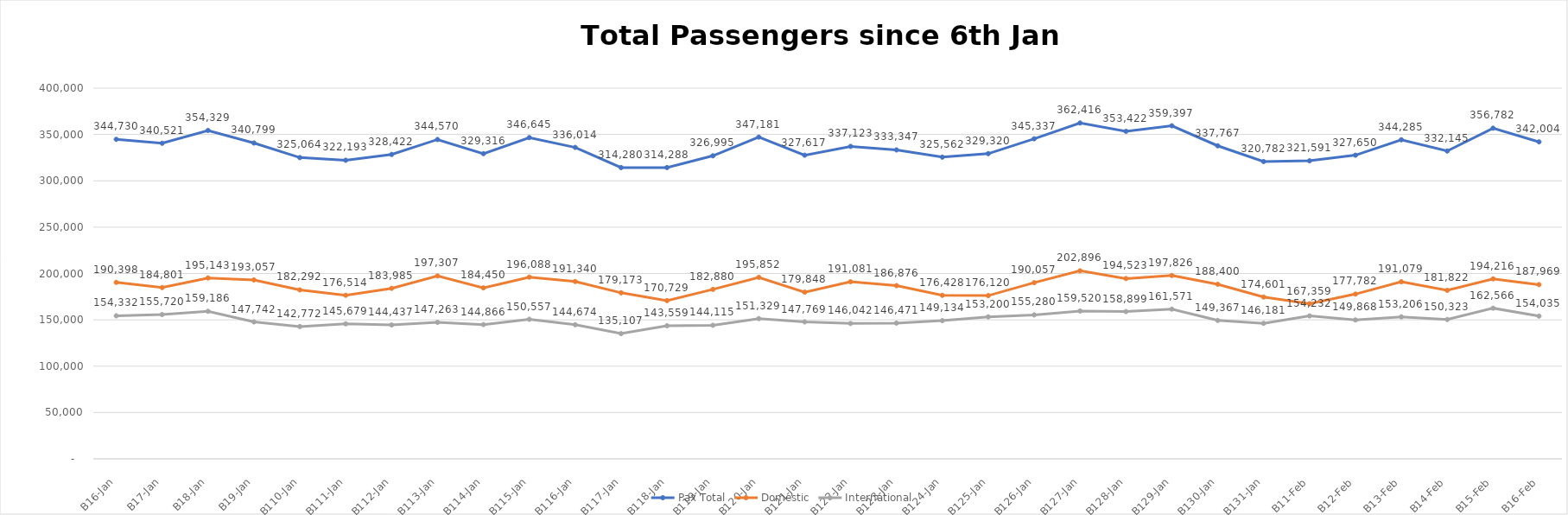
| Category | Pax Total |  Domestic  |  International  |
|---|---|---|---|
| 2023-01-06 | 344730 | 190398 | 154332 |
| 2023-01-07 | 340521 | 184801 | 155720 |
| 2023-01-08 | 354329 | 195143 | 159186 |
| 2023-01-09 | 340799 | 193057 | 147742 |
| 2023-01-10 | 325064 | 182292 | 142772 |
| 2023-01-11 | 322193 | 176514 | 145679 |
| 2023-01-12 | 328422 | 183985 | 144437 |
| 2023-01-13 | 344570 | 197307 | 147263 |
| 2023-01-14 | 329316 | 184450 | 144866 |
| 2023-01-15 | 346645 | 196088 | 150557 |
| 2023-01-16 | 336014 | 191340 | 144674 |
| 2023-01-17 | 314280 | 179173 | 135107 |
| 2023-01-18 | 314288 | 170729 | 143559 |
| 2023-01-19 | 326995 | 182880 | 144115 |
| 2023-01-20 | 347181 | 195852 | 151329 |
| 2023-01-21 | 327617 | 179848 | 147769 |
| 2023-01-22 | 337123 | 191081 | 146042 |
| 2023-01-23 | 333347 | 186876 | 146471 |
| 2023-01-24 | 325562 | 176428 | 149134 |
| 2023-01-25 | 329320 | 176120 | 153200 |
| 2023-01-26 | 345337 | 190057 | 155280 |
| 2023-01-27 | 362416 | 202896 | 159520 |
| 2023-01-28 | 353422 | 194523 | 158899 |
| 2023-01-29 | 359397 | 197826 | 161571 |
| 2023-01-30 | 337767 | 188400 | 149367 |
| 2023-01-31 | 320782 | 174601 | 146181 |
| 2023-02-01 | 321591 | 167359 | 154232 |
| 2023-02-02 | 327650 | 177782 | 149868 |
| 2023-02-03 | 344285 | 191079 | 153206 |
| 2023-02-04 | 332145 | 181822 | 150323 |
| 2023-02-05 | 356782 | 194216 | 162566 |
| 2023-02-06 | 342004 | 187969 | 154035 |